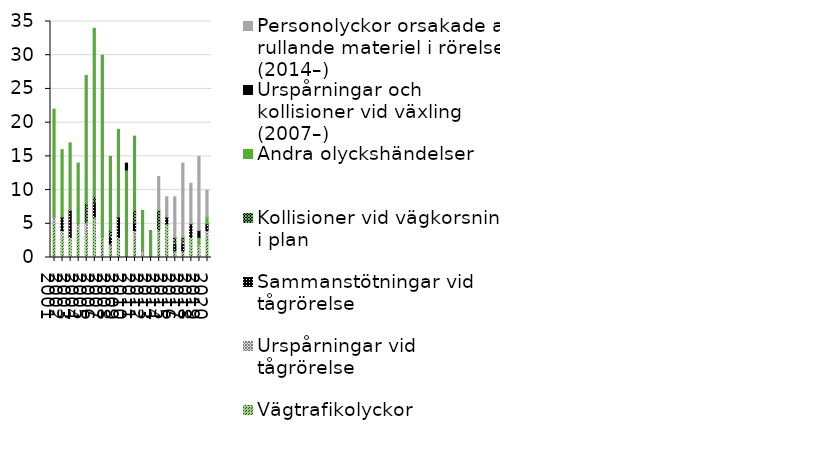
| Category | Vägtrafikolyckor | Urspårningar vid tågrörelse  | Sammanstötningar vid tågrörelse | Kollisioner vid vägkorsning i plan | Andra olyckshändelser | Urspårningar och kollisioner vid växling  (2007–) | Personolyckor orsakade av rullande materiel i rörelse (2014–) |
|---|---|---|---|---|---|---|---|
| 2001 | 5 | 1 | 0 | 0 | 16 | 0 | 0 |
| 2002 | 3 | 1 | 2 | 0 | 10 | 0 | 0 |
| 2003 | 3 | 0 | 4 | 0 | 10 | 0 | 0 |
| 2004 | 4 | 1 | 0 | 0 | 9 | 0 | 0 |
| 2005 | 4 | 1 | 0 | 3 | 19 | 0 | 0 |
| 2006 | 6 | 0 | 2 | 1 | 25 | 0 | 0 |
| 2007 | 3 | 0 | 0 | 0 | 27 | 0 | 0 |
| 2008 | 2 | 0 | 1 | 1 | 11 | 0 | 0 |
| 2009 | 3 | 0 | 3 | 0 | 13 | 0 | 0 |
| 2010 | 0 | 0 | 0 | 0 | 13 | 1 | 0 |
| 2011 | 3 | 1 | 1 | 2 | 11 | 0 | 0 |
| 2012 | 0 | 1 | 0 | 0 | 6 | 0 | 0 |
| 2013 | 0 | 0 | 0 | 0 | 4 | 0 | 0 |
| 2014 | 4 | 0 | 0 | 3 | 0 | 0 | 5 |
| 2015 | 5 | 0 | 1 | 0 | 0 | 0 | 3 |
| 2016 | 1 | 0 | 1 | 1 | 0 | 0 | 6 |
| 2017 | 1 | 0 | 1 | 1 | 0 | 0 | 11 |
| 2018 | 3 | 0 | 2 | 0 | 0 | 0 | 6 |
| 2019 | 2 | 0 | 0 | 0 | 1 | 1 | 11 |
| 2020 | 3 | 1 | 1 | 0 | 1 | 0 | 4 |